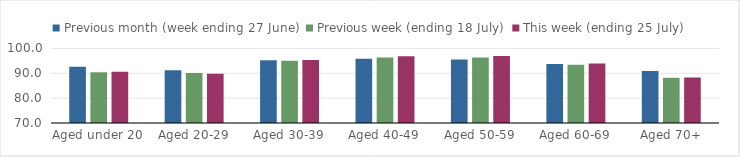
| Category | Previous month (week ending 27 June) | Previous week (ending 18 July) | This week (ending 25 July) |
|---|---|---|---|
| Aged under 20 | 92.658 | 90.397 | 90.658 |
| Aged 20-29 | 91.263 | 90.124 | 89.817 |
| Aged 30-39 | 95.252 | 95.084 | 95.348 |
| Aged 40-49 | 95.834 | 96.334 | 96.903 |
| Aged 50-59 | 95.527 | 96.341 | 96.985 |
| Aged 60-69 | 93.772 | 93.453 | 93.927 |
| Aged 70+ | 90.878 | 88.186 | 88.31 |